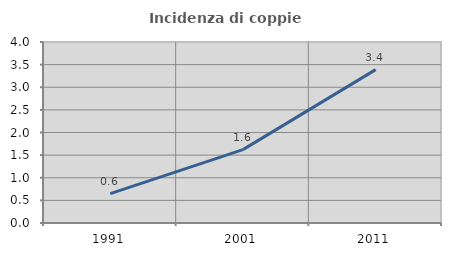
| Category | Incidenza di coppie miste |
|---|---|
| 1991.0 | 0.648 |
| 2001.0 | 1.622 |
| 2011.0 | 3.389 |